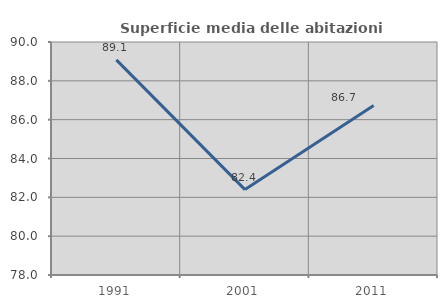
| Category | Superficie media delle abitazioni occupate |
|---|---|
| 1991.0 | 89.079 |
| 2001.0 | 82.399 |
| 2011.0 | 86.726 |